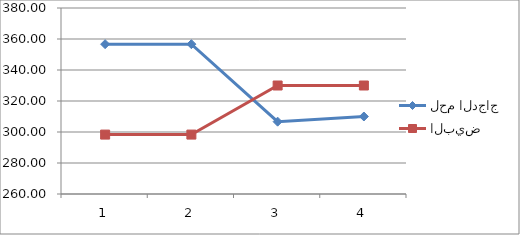
| Category | لحم الدجاج | البيض |
|---|---|---|
| 0 | 356.67 | 298.33 |
| 1 | 356.67 | 298.33 |
| 2 | 306.67 | 330 |
| 3 | 310 | 330 |